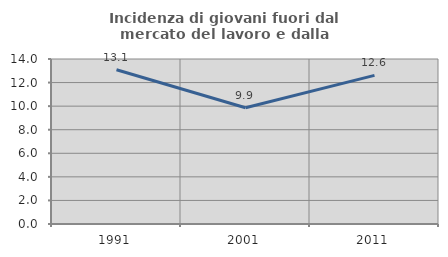
| Category | Incidenza di giovani fuori dal mercato del lavoro e dalla formazione  |
|---|---|
| 1991.0 | 13.084 |
| 2001.0 | 9.868 |
| 2011.0 | 12.613 |